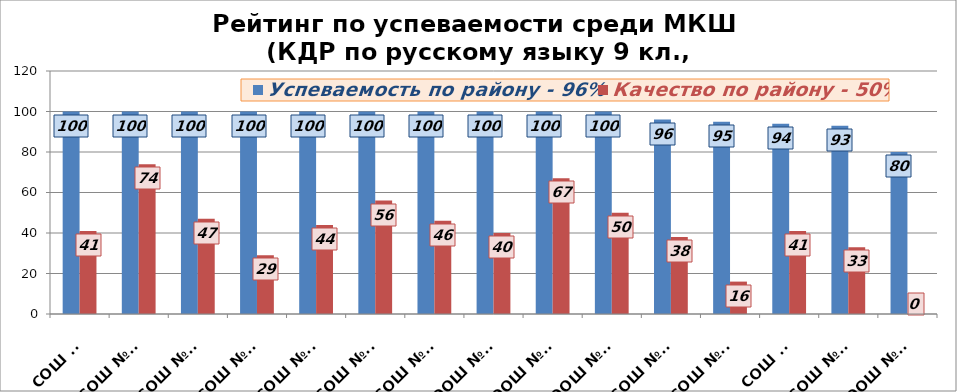
| Category | Успеваемость по району - 96% | Качество по району - 50% |
|---|---|---|
| СОШ №8 | 100 | 41 |
| СОШ №14 | 100 | 74 |
| СОШ №16 | 100 | 47 |
| СОШ №17 | 100 | 29 |
| СОШ №18 | 100 | 44 |
| СОШ №21 | 100 | 56 |
| СОШ №22 | 100 | 46 |
| ООШ №27 | 100 | 40 |
| ООШ №28 | 100 | 67 |
| ООШ №31 | 100 | 50 |
| СОШ №15 | 96 | 38 |
| СОШ №10 | 95 | 16 |
| СОШ №9 | 94 | 41 |
| СОШ №24 | 93 | 33 |
| ООШ №26 | 80 | 0 |